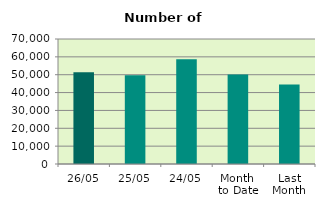
| Category | Series 0 |
|---|---|
| 26/05 | 51436 |
| 25/05 | 49670 |
| 24/05 | 58598 |
| Month 
to Date | 50123.895 |
| Last
Month | 44538 |